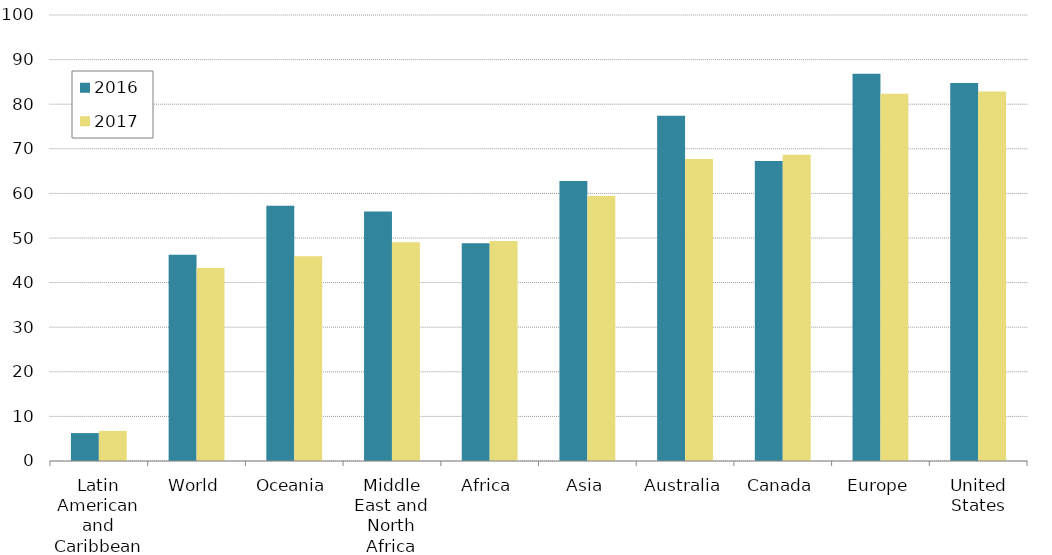
| Category | 2016 | 2017 |
|---|---|---|
| Latin American and Caribbean | 6.26 | 6.753 |
| World | 46.256 | 43.259 |
| Oceania | 57.233 | 45.887 |
| Middle East and North Africa | 55.931 | 49.057 |
| Africa | 48.821 | 49.301 |
| Asia | 62.757 | 59.427 |
| Australia | 77.42 | 67.73 |
| Canada | 67.29 | 68.66 |
| Europe | 86.82 | 82.33 |
| United States | 84.78 | 82.86 |